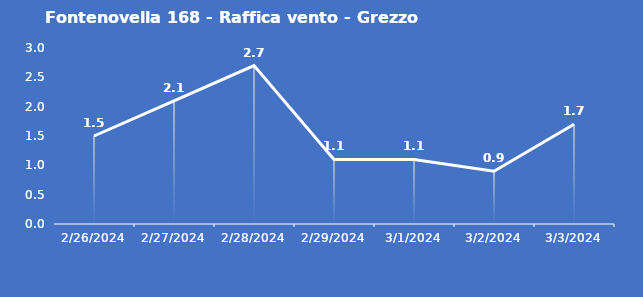
| Category | Fontenovella 168 - Raffica vento - Grezzo (m/s) |
|---|---|
| 2/26/24 | 1.5 |
| 2/27/24 | 2.1 |
| 2/28/24 | 2.7 |
| 2/29/24 | 1.1 |
| 3/1/24 | 1.1 |
| 3/2/24 | 0.9 |
| 3/3/24 | 1.7 |